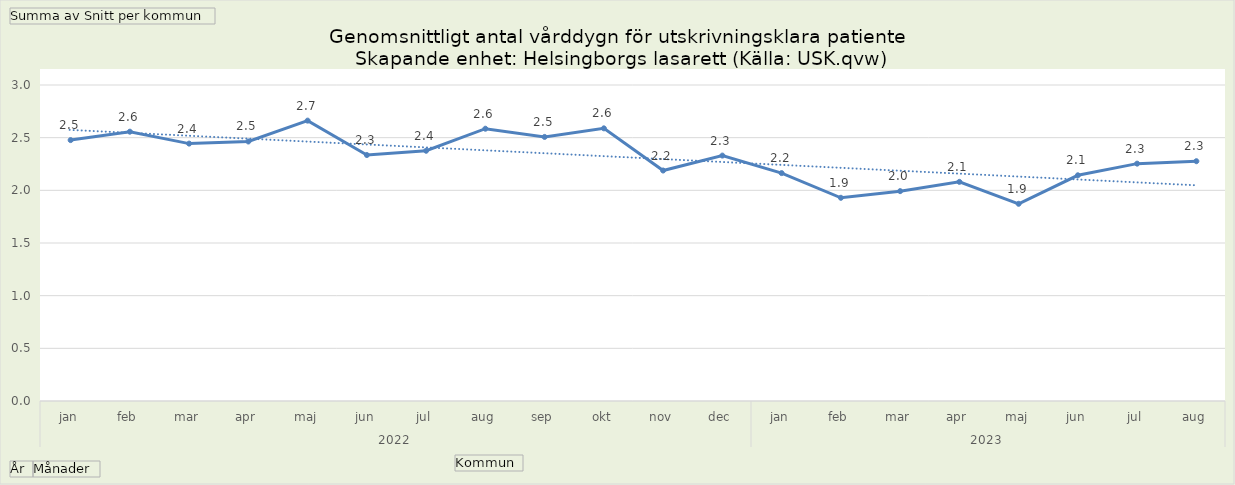
| Category | Kommuner NV |
|---|---|
| 0 | 2.477 |
| 1 | 2.557 |
| 2 | 2.444 |
| 3 | 2.464 |
| 4 | 2.662 |
| 5 | 2.335 |
| 6 | 2.376 |
| 7 | 2.585 |
| 8 | 2.507 |
| 9 | 2.589 |
| 10 | 2.188 |
| 11 | 2.33 |
| 12 | 2.164 |
| 13 | 1.929 |
| 14 | 1.992 |
| 15 | 2.081 |
| 16 | 1.872 |
| 17 | 2.143 |
| 18 | 2.253 |
| 19 | 2.276 |